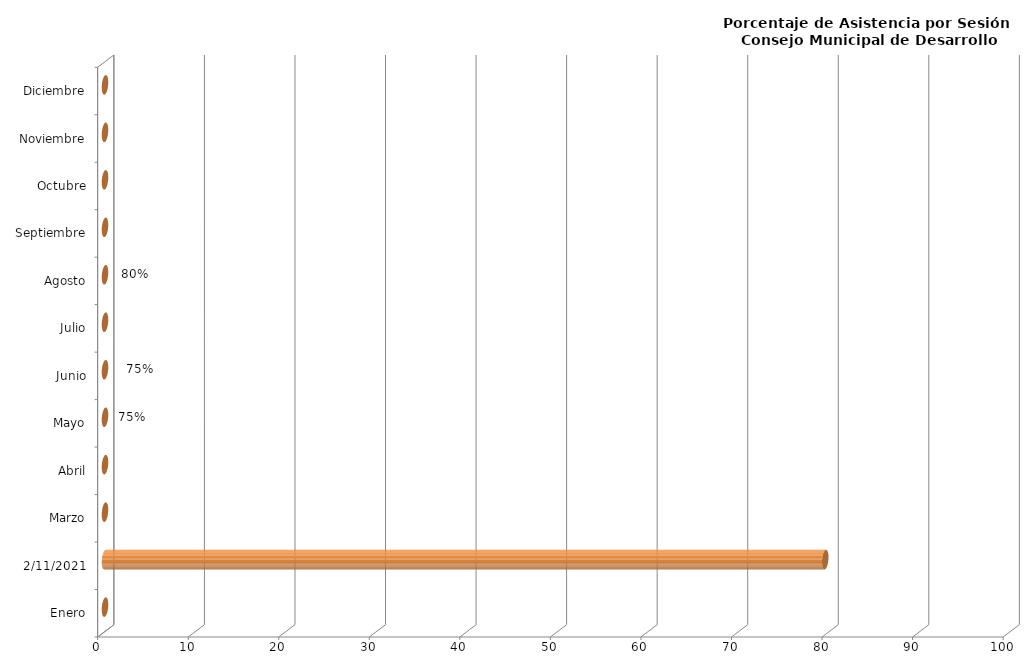
| Category | Series 0 |
|---|---|
| Enero | 0 |
| 11/02/2021 | 79.545 |
| Marzo | 0 |
| Abril | 0 |
| Mayo | 0 |
| Junio | 0 |
| Julio | 0 |
| Agosto | 0 |
| Septiembre | 0 |
| Octubre | 0 |
| Noviembre | 0 |
| Diciembre | 0 |